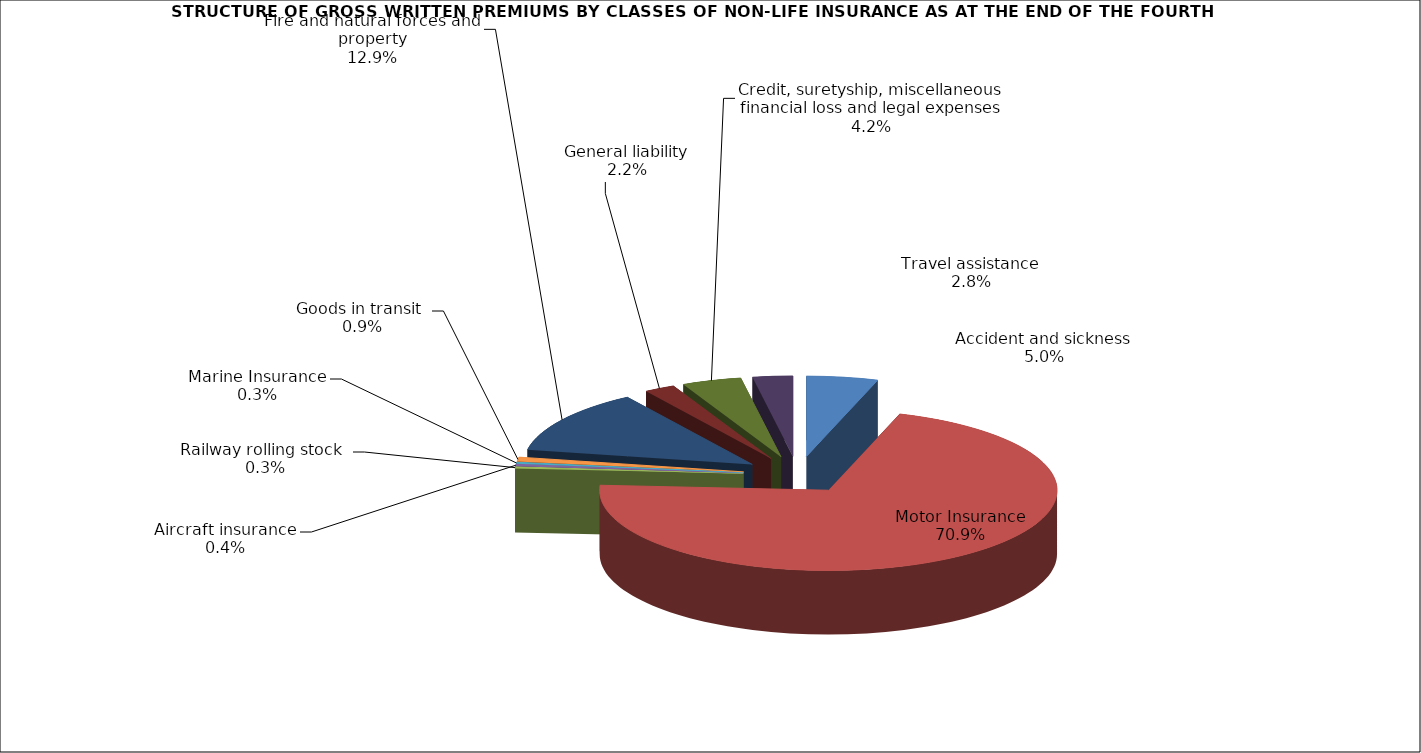
| Category | Accident and sickness |
|---|---|
| Accident and sickness | 0.05 |
| Motor Insurance | 0.709 |
| Railway rolling stock  | 0.003 |
| Aircraft insurance | 0.004 |
| Marine Insurance | 0.003 |
| Goods in transit  | 0.009 |
| Fire and natural forces and property | 0.129 |
| General liability | 0.022 |
| Credit, suretyship, miscellaneous financial loss and legal expenses | 0.042 |
| Travel assistance | 0.028 |